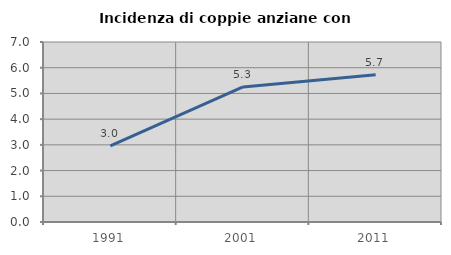
| Category | Incidenza di coppie anziane con figli |
|---|---|
| 1991.0 | 2.962 |
| 2001.0 | 5.254 |
| 2011.0 | 5.725 |